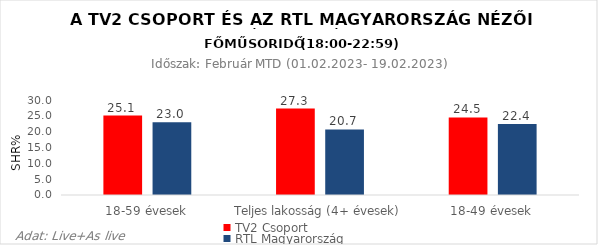
| Category | TV2 Csoport | RTL Magyarország |
|---|---|---|
| 18-59 évesek | 25.1 | 23 |
| Teljes lakosság (4+ évesek) | 27.3 | 20.7 |
| 18-49 évesek | 24.5 | 22.4 |